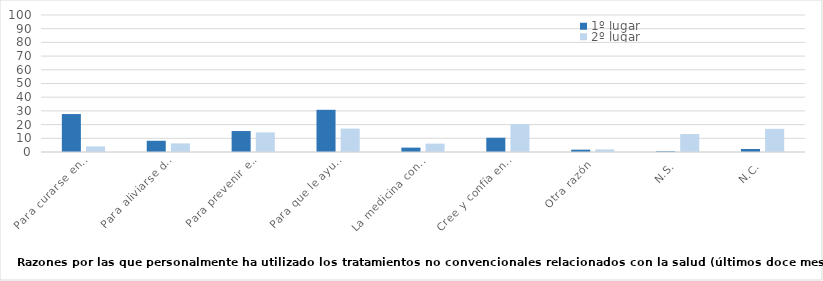
| Category | 1º lugar | 2º lugar |
|---|---|---|
| Para curarse enfermedades y dolencias para las que la medicina convencional no le funciona | 27.7 | 4.1 |
| Para aliviarse de los efectos secundarios de los tratamientos médicos convencionales (con medicinas) | 8.2 | 6.3 |
| Para prevenir enfermedades y dolencias | 15.3 | 14.3 |
| Para que le ayuden a tener una vida sana y equilibrada | 30.8 | 17.1 |
| La medicina convencional a veces es perjudicial para su salud | 3.2 | 6.1 |
| Cree y confía en ellas | 10.4 | 20.3 |
| Otra razón | 1.7 | 1.9 |
| N.S. | 0.5 | 13.1 |
| N.C. | 2.2 | 16.9 |